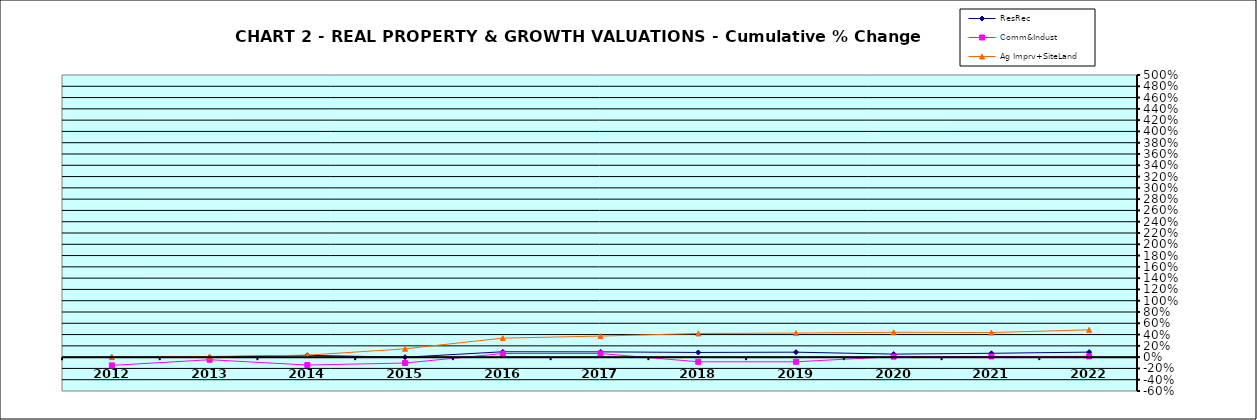
| Category | ResRec | Comm&Indust | Ag Imprv+SiteLand |
|---|---|---|---|
| 2012.0 | -0.003 | -0.146 | 0 |
| 2013.0 | 0.005 | -0.046 | 0.011 |
| 2014.0 | 0.032 | -0.14 | 0.035 |
| 2015.0 | -0.001 | -0.104 | 0.147 |
| 2016.0 | 0.095 | 0.065 | 0.337 |
| 2017.0 | 0.093 | 0.065 | 0.373 |
| 2018.0 | 0.083 | -0.082 | 0.42 |
| 2019.0 | 0.088 | -0.082 | 0.426 |
| 2020.0 | 0.054 | 0.009 | 0.441 |
| 2021.0 | 0.068 | 0.012 | 0.436 |
| 2022.0 | 0.089 | 0.013 | 0.484 |